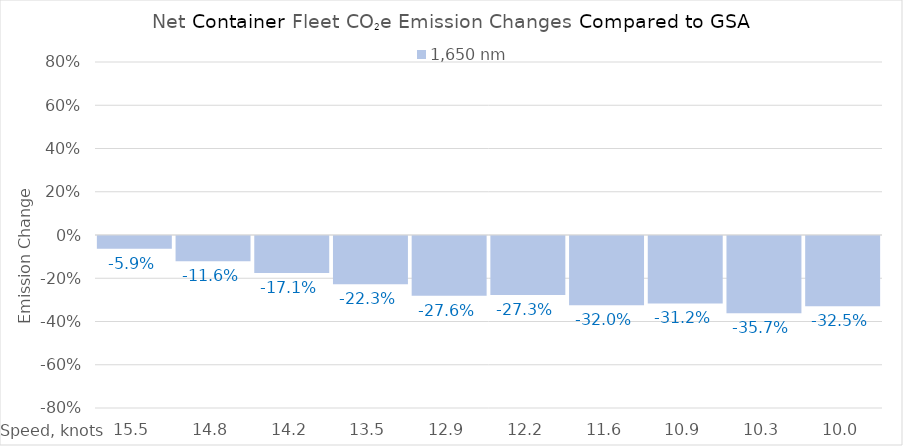
| Category | 1,650 |
|---|---|
| 15.450000000000001 | -0.059 |
| 14.8 | -0.116 |
| 14.15 | -0.171 |
| 13.5 | -0.223 |
| 12.85 | -0.276 |
| 12.2 | -0.273 |
| 11.549999999999999 | -0.32 |
| 10.899999999999999 | -0.312 |
| 10.249999999999998 | -0.357 |
| 10.0 | -0.325 |